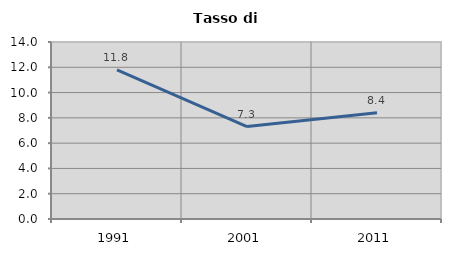
| Category | Tasso di disoccupazione   |
|---|---|
| 1991.0 | 11.791 |
| 2001.0 | 7.308 |
| 2011.0 | 8.408 |